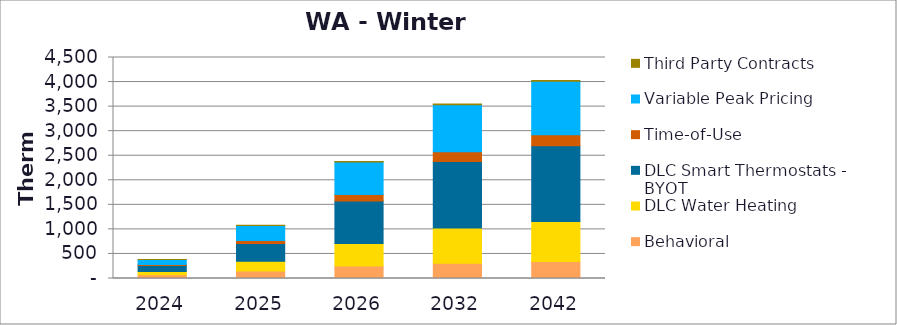
| Category | Behavioral | DLC Water Heating | DLC Smart Thermostats - BYOT | Time-of-Use | Variable Peak Pricing | Third Party Contracts |
|---|---|---|---|---|---|---|
| 2024.0 | 78.153 | 64.116 | 120.096 | 20.265 | 103.442 | 2.689 |
| 2025.0 | 154.703 | 194.744 | 365.001 | 60.11 | 302.792 | 5.456 |
| 2026.0 | 254.034 | 459.901 | 862.623 | 135.119 | 662.484 | 9.452 |
| 2032.0 | 308.877 | 718.822 | 1353.811 | 199.749 | 958.9 | 12.415 |
| 2042.0 | 347.979 | 814.092 | 1539.702 | 226.583 | 1086.982 | 14.915 |